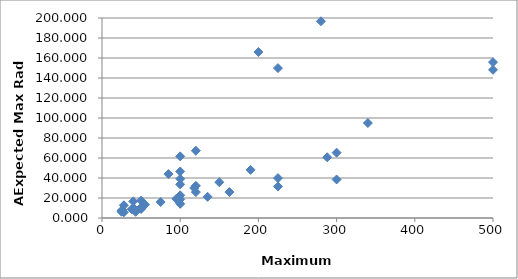
| Category | Series 0 |
|---|---|
| 25.0 | 6.209 |
| 28.0 | 5.751 |
| 150.0 | 35.78 |
| 50.0 | 9.019 |
| 50.0 | 10.208 |
| 600.0 | 763.995 |
| 280.0 | 196.721 |
| 100.0 | 61.653 |
| 40.0 | 16.654 |
| 100.0 | 39.134 |
| 28.0 | 12.732 |
| 26.0 | 8.123 |
| 500.0 | 155.837 |
| 55.0 | 13.356 |
| 40.0 | 9.774 |
| 50.0 | 17.348 |
| 25.0 | 7.167 |
| 42.0 | 8.538 |
| 95.0 | 19.118 |
| 75.0 | 15.981 |
| 50.0 | 10.436 |
| 43.0 | 6.174 |
| 50.0 | 9.833 |
| 38.0 | 8.744 |
| 340.0 | 94.984 |
| 1300.0 | 294.32 |
| 163.0 | 25.925 |
| 100.0 | 18.645 |
| 300.0 | 65.32 |
| 1800.0 | 964.94 |
| 200.0 | 165.968 |
| 120.0 | 67.275 |
| 100.0 | 33.574 |
| 100.0 | 46.547 |
| 85.0 | 43.938 |
| 100.0 | 22.679 |
| 500.0 | 148.209 |
| 118.0 | 29.976 |
| 190.0 | 48.121 |
| 120.0 | 25.915 |
| 120.0 | 32.157 |
| 288.0 | 60.724 |
| 300.0 | 38.525 |
| 100.0 | 14.163 |
| 225.0 | 39.918 |
| 225.0 | 31.536 |
| 135.0 | 21.179 |
| 225.0 | 149.881 |